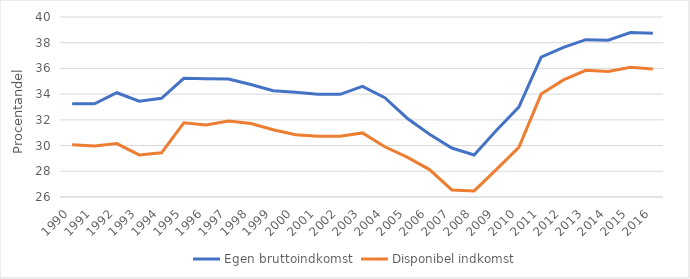
| Category | Egen bruttoindkomst | Disponibel indkomst |
|---|---|---|
| 1990 | 33.252 | 30.058 |
| 1991 | 33.251 | 29.974 |
| 1992 | 34.11 | 30.156 |
| 1993 | 33.45 | 29.27 |
| 1994 | 33.678 | 29.434 |
| 1995 | 35.233 | 31.772 |
| 1996 | 35.196 | 31.61 |
| 1997 | 35.169 | 31.901 |
| 1998 | 34.746 | 31.709 |
| 1999 | 34.263 | 31.236 |
| 2000 | 34.147 | 30.842 |
| 2001 | 33.992 | 30.729 |
| 2002 | 33.986 | 30.72 |
| 2003 | 34.599 | 30.983 |
| 2004 | 33.721 | 29.906 |
| 2005 | 32.128 | 29.097 |
| 2006 | 30.884 | 28.134 |
| 2007 | 29.81 | 26.549 |
| 2008 | 29.267 | 26.471 |
| 2009 | 31.198 | 28.144 |
| 2010 | 32.993 | 29.857 |
| 2011 | 36.879 | 34.007 |
| 2012 | 37.634 | 35.106 |
| 2013 | 38.236 | 35.857 |
| 2014 | 38.201 | 35.763 |
| 2015 | 38.789 | 36.085 |
| 2016 | 38.743 | 35.95 |